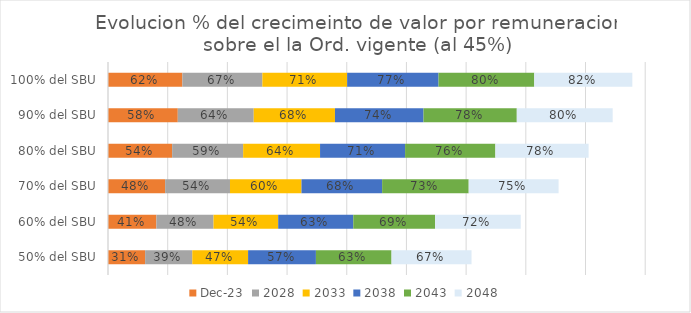
| Category | dic-23 | 2028 | 2033 | 2038 | 2043 | 2048 |
|---|---|---|---|---|---|---|
| 50% del SBU | 0.311 | 0.395 | 0.468 | 0.568 | 0.633 | 0.67 |
| 60% del SBU | 0.405 | 0.479 | 0.542 | 0.629 | 0.686 | 0.717 |
| 70% del SBU | 0.479 | 0.543 | 0.599 | 0.676 | 0.725 | 0.753 |
| 80% del SBU | 0.537 | 0.595 | 0.644 | 0.712 | 0.757 | 0.781 |
| 90% del SBU | 0.585 | 0.636 | 0.681 | 0.742 | 0.781 | 0.803 |
| 100% del SBU | 0.623 | 0.67 | 0.71 | 0.766 | 0.802 | 0.822 |